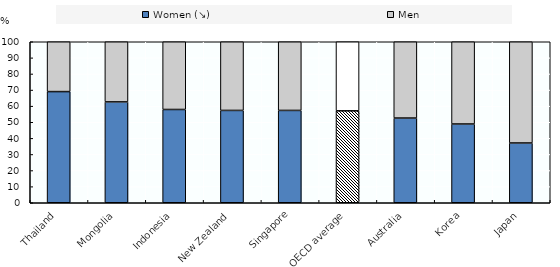
| Category | Women (↘) | Men |
|---|---|---|
| Thailand | 69.049 | 30.951 |
| Mongolia | 62.64 | 37.36 |
| Indonesia | 57.931 | 42.069 |
| New Zealand | 57.356 | 42.644 |
| Singapore | 57.356 | 42.644 |
| OECD average | 57.1 | 42.9 |
| Australia | 52.617 | 47.383 |
| Korea | 48.921 | 51.079 |
| Japan | 37.13 | 62.87 |